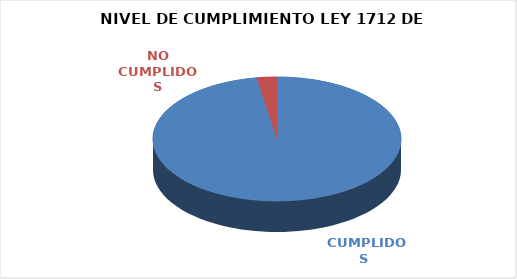
| Category | Series 0 |
|---|---|
|  CUMPLIDOS | 111 |
| NO CUMPLIDOS | 3 |